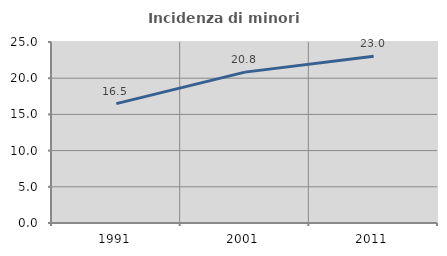
| Category | Incidenza di minori stranieri |
|---|---|
| 1991.0 | 16.489 |
| 2001.0 | 20.838 |
| 2011.0 | 23.027 |